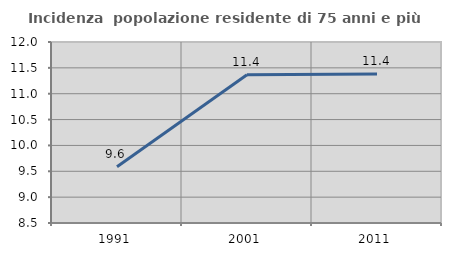
| Category | Incidenza  popolazione residente di 75 anni e più |
|---|---|
| 1991.0 | 9.589 |
| 2001.0 | 11.367 |
| 2011.0 | 11.383 |